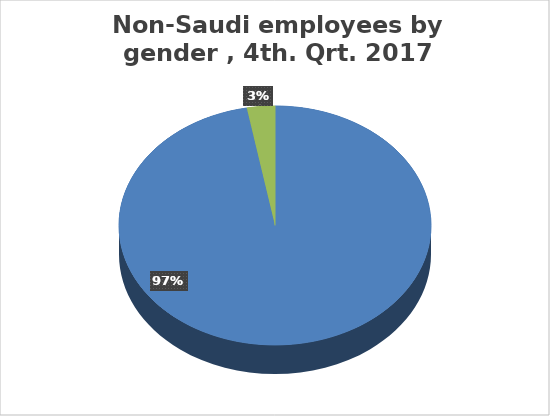
| Category | Series 0 |
|---|---|
| Male | 4466397 |
| Female | 133358 |